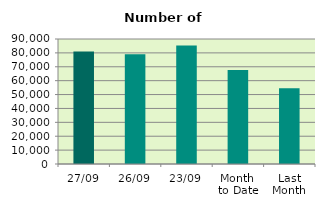
| Category | Series 0 |
|---|---|
| 27/09 | 81086 |
| 26/09 | 78944 |
| 23/09 | 85250 |
| Month 
to Date | 67590.105 |
| Last
Month | 54581.565 |